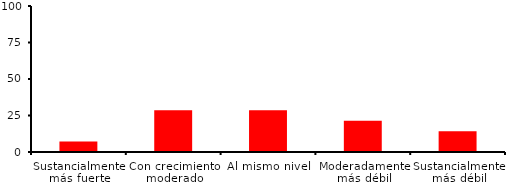
| Category | Series 0 |
|---|---|
| Sustancialmente más fuerte | 7.143 |
| Con crecimiento moderado | 28.571 |
| Al mismo nivel | 28.571 |
| Moderadamente más débil | 21.429 |
| Sustancialmente más débil | 14.286 |